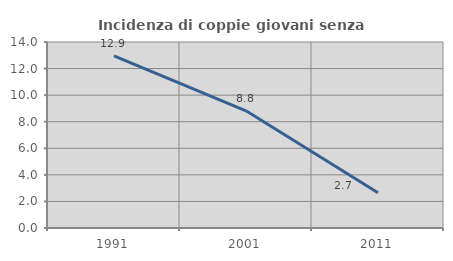
| Category | Incidenza di coppie giovani senza figli |
|---|---|
| 1991.0 | 12.948 |
| 2001.0 | 8.824 |
| 2011.0 | 2.657 |